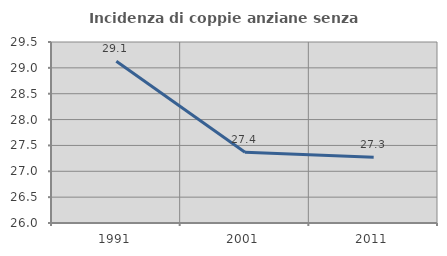
| Category | Incidenza di coppie anziane senza figli  |
|---|---|
| 1991.0 | 29.126 |
| 2001.0 | 27.368 |
| 2011.0 | 27.273 |